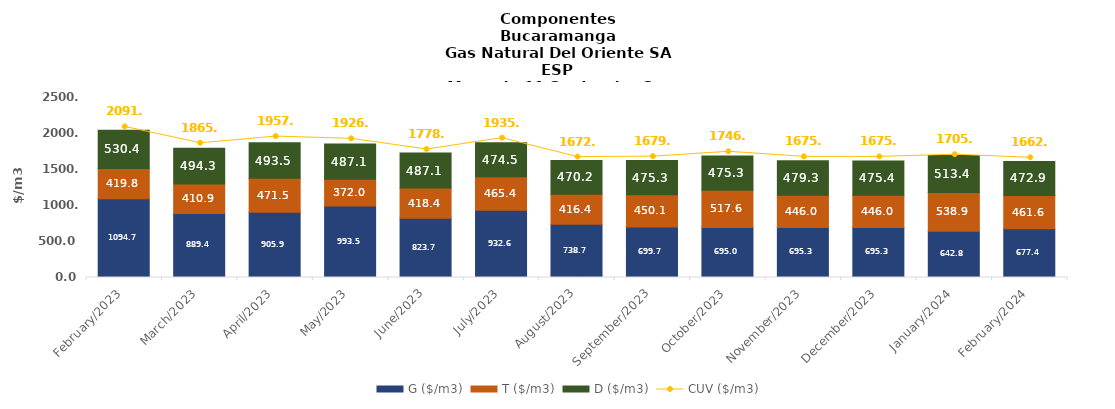
| Category | G ($/m3) | T ($/m3) | D ($/m3) |
|---|---|---|---|
| 2023-02-01 | 1094.71 | 419.79 | 530.39 |
| 2023-03-01 | 889.39 | 410.92 | 494.25 |
| 2023-04-01 | 905.91 | 471.46 | 493.54 |
| 2023-05-01 | 993.53 | 372.04 | 487.06 |
| 2023-06-01 | 823.66 | 418.43 | 487.06 |
| 2023-07-01 | 932.63 | 465.37 | 474.47 |
| 2023-08-01 | 738.7 | 416.42 | 470.2 |
| 2023-09-01 | 699.68 | 450.11 | 475.33 |
| 2023-10-01 | 694.96 | 517.63 | 475.33 |
| 2023-11-01 | 695.28 | 446.03 | 479.27 |
| 2023-12-01 | 695.28 | 446.03 | 475.44 |
| 2024-01-01 | 642.83 | 538.87 | 513.39 |
| 2024-02-01 | 677.42 | 461.59 | 472.92 |